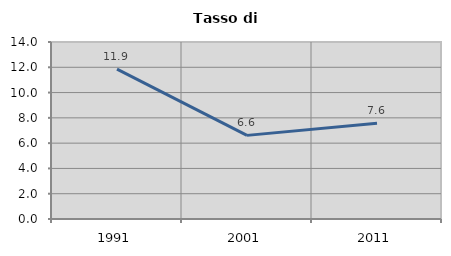
| Category | Tasso di disoccupazione   |
|---|---|
| 1991.0 | 11.857 |
| 2001.0 | 6.615 |
| 2011.0 | 7.567 |